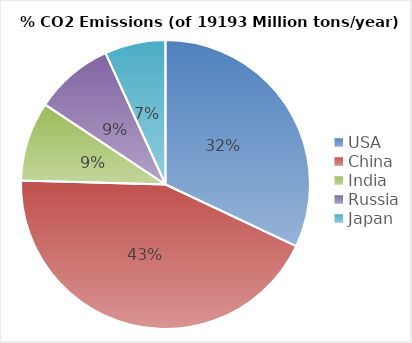
| Category | Millions of Tons of CO2 |
|---|---|
| USA | 6144.851 |
| China | 8332.516 |
| India | 1707.459 |
| Russia | 1700.199 |
| Japan | 1308.396 |